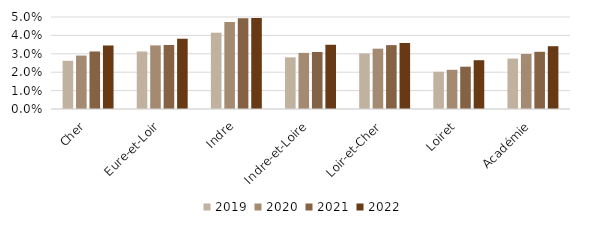
| Category | 2019 | 2020 | 2021 | 2022 |
|---|---|---|---|---|
| Cher | 0.026 | 0.029 | 0.031 | 0.035 |
| Eure-et-Loir | 0.031 | 0.035 | 0.035 | 0.038 |
| Indre | 0.041 | 0.047 | 0.049 | 0.049 |
| Indre-et-Loire | 0.028 | 0.031 | 0.031 | 0.035 |
| Loir-et-Cher | 0.03 | 0.033 | 0.035 | 0.036 |
| Loiret | 0.02 | 0.021 | 0.023 | 0.027 |
| Académie | 0.027 | 0.03 | 0.031 | 0.034 |